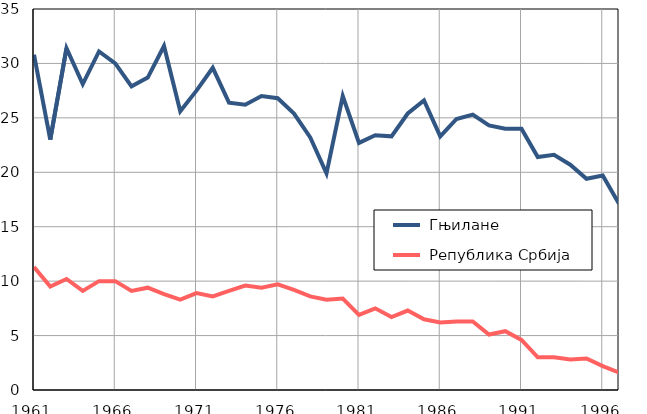
| Category |  Гњилане |  Република Србија |
|---|---|---|
| 1961.0 | 30.8 | 11.3 |
| 1962.0 | 23 | 9.5 |
| 1963.0 | 31.4 | 10.2 |
| 1964.0 | 28.1 | 9.1 |
| 1965.0 | 31.1 | 10 |
| 1966.0 | 30 | 10 |
| 1967.0 | 27.9 | 9.1 |
| 1968.0 | 28.7 | 9.4 |
| 1969.0 | 31.6 | 8.8 |
| 1970.0 | 25.6 | 8.3 |
| 1971.0 | 27.5 | 8.9 |
| 1972.0 | 29.6 | 8.6 |
| 1973.0 | 26.4 | 9.1 |
| 1974.0 | 26.2 | 9.6 |
| 1975.0 | 27 | 9.4 |
| 1976.0 | 26.8 | 9.7 |
| 1977.0 | 25.4 | 9.2 |
| 1978.0 | 23.2 | 8.6 |
| 1979.0 | 19.9 | 8.3 |
| 1980.0 | 27 | 8.4 |
| 1981.0 | 22.7 | 6.9 |
| 1982.0 | 23.4 | 7.5 |
| 1983.0 | 23.3 | 6.7 |
| 1984.0 | 25.4 | 7.3 |
| 1985.0 | 26.6 | 6.5 |
| 1986.0 | 23.3 | 6.2 |
| 1987.0 | 24.9 | 6.3 |
| 1988.0 | 25.3 | 6.3 |
| 1989.0 | 24.3 | 5.1 |
| 1990.0 | 24 | 5.4 |
| 1991.0 | 24 | 4.6 |
| 1992.0 | 21.4 | 3 |
| 1993.0 | 21.6 | 3 |
| 1994.0 | 20.7 | 2.8 |
| 1995.0 | 19.4 | 2.9 |
| 1996.0 | 19.7 | 2.2 |
| 1997.0 | 17.1 | 1.6 |